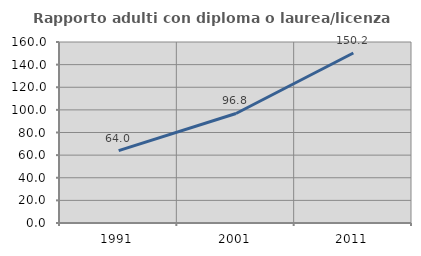
| Category | Rapporto adulti con diploma o laurea/licenza media  |
|---|---|
| 1991.0 | 64.034 |
| 2001.0 | 96.825 |
| 2011.0 | 150.247 |